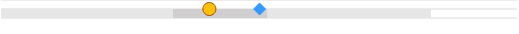
| Category | left | mid start | mid end | right |
|---|---|---|---|---|
| 0 | 0 | 0.4 | 0.22 | 0.38 |